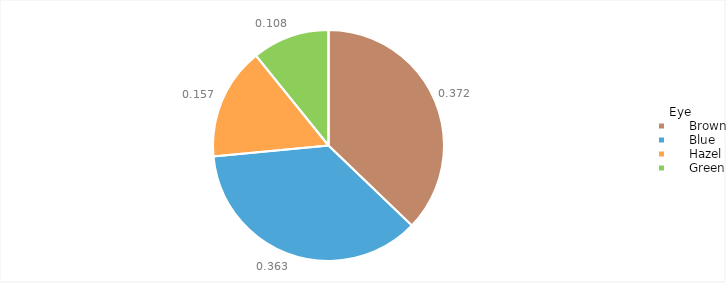
| Category | Series 0 |
|---|---|
| Eye | 0 |
|      Brown | 0.372 |
|      Blue | 0.363 |
|      Hazel | 0.157 |
|      Green | 0.108 |